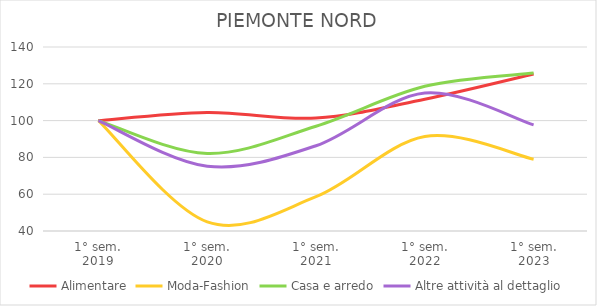
| Category | Alimentare | Moda-Fashion | Casa e arredo | Altre attività al dettaglio |
|---|---|---|---|---|
| 1° sem.
2019 | 100 | 100 | 100 | 100 |
| 1° sem.
2020 | 104.457 | 44.969 | 82.129 | 75.235 |
| 1° sem.
2021 | 101.366 | 58.634 | 96.958 | 86.347 |
| 1° sem.
2022 | 111.646 | 91.304 | 118.631 | 114.972 |
| 1° sem.
2023 | 125.306 | 79.006 | 125.856 | 97.646 |